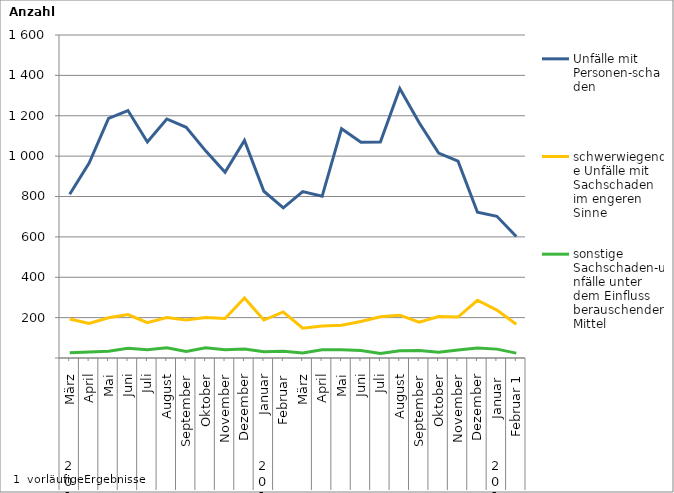
| Category | Unfälle mit Personen-schaden | schwerwiegende Unfälle mit Sachschaden   im engeren Sinne | sonstige Sachschaden-unfälle unter dem Einfluss berauschender Mittel |
|---|---|---|---|
| 0 | 811 | 193 | 26 |
| 1 | 966 | 171 | 30 |
| 2 | 1187 | 199 | 33 |
| 3 | 1226 | 215 | 48 |
| 4 | 1070 | 175 | 41 |
| 5 | 1184 | 200 | 51 |
| 6 | 1143 | 188 | 32 |
| 7 | 1026 | 200 | 51 |
| 8 | 920 | 196 | 41 |
| 9 | 1078 | 297 | 45 |
| 10 | 826 | 188 | 31 |
| 11 | 744 | 228 | 34 |
| 12 | 824 | 148 | 25 |
| 13 | 801 | 159 | 41 |
| 14 | 1136 | 162 | 41 |
| 15 | 1069 | 181 | 37 |
| 16 | 1070 | 204 | 22 |
| 17 | 1335 | 212 | 36 |
| 18 | 1165 | 177 | 37 |
| 19 | 1015 | 205 | 28 |
| 20 | 975 | 203 | 40 |
| 21 | 722 | 286 | 50 |
| 22 | 702 | 237 | 44 |
| 23 | 602 | 167 | 24 |